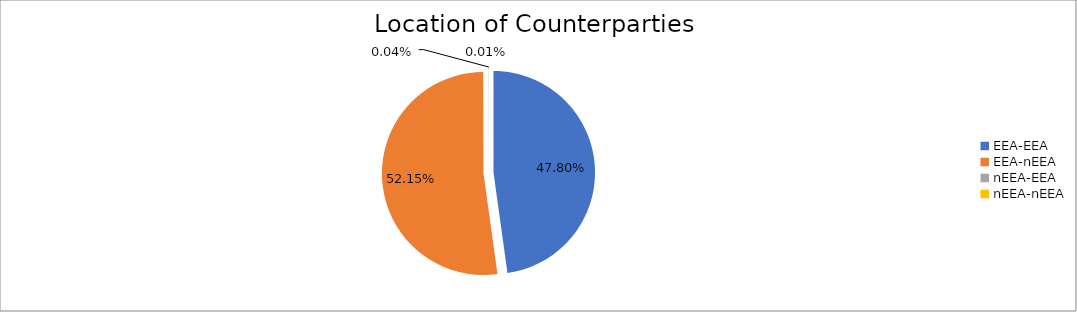
| Category | Series 0 |
|---|---|
| EEA-EEA | 6063322.246 |
| EEA-nEEA | 6615172.687 |
| nEEA-EEA | 5086.307 |
| nEEA-nEEA | 769.769 |